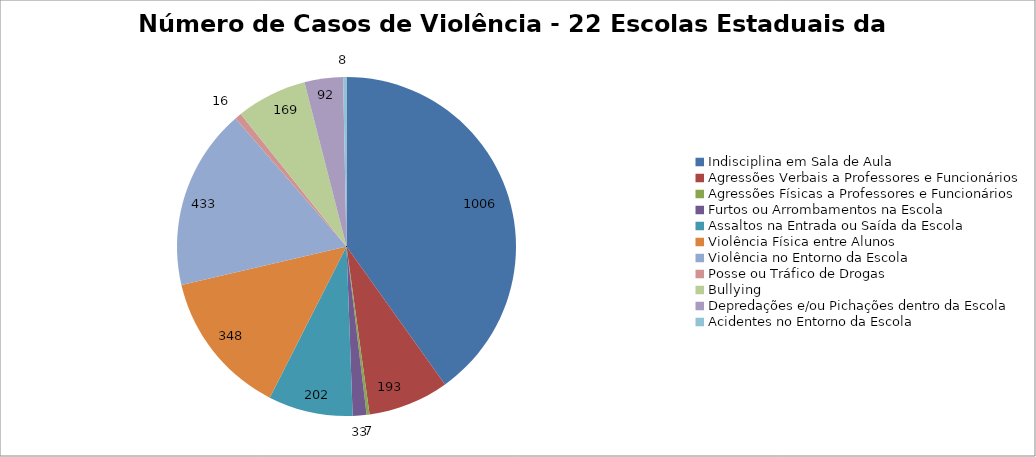
| Category | Número de Casos |
|---|---|
| Indisciplina em Sala de Aula | 1006 |
| Agressões Verbais a Professores e Funcionários | 193 |
| Agressões Físicas a Professores e Funcionários | 7 |
| Furtos ou Arrombamentos na Escola | 33 |
| Assaltos na Entrada ou Saída da Escola | 202 |
| Violência Física entre Alunos | 348 |
| Violência no Entorno da Escola | 433 |
| Posse ou Tráfico de Drogas | 16 |
| Bullying | 169 |
| Depredações e/ou Pichações dentro da Escola | 92 |
| Acidentes no Entorno da Escola | 8 |